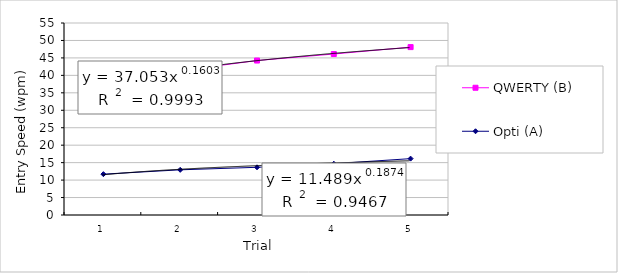
| Category | QWERTY (B) | Opti (A) |
|---|---|---|
| 0 | 37.098 | 11.701 |
| 1 | 41.324 | 12.944 |
| 2 | 44.244 | 13.663 |
| 3 | 46.114 | 14.693 |
| 4 | 48.096 | 16.146 |